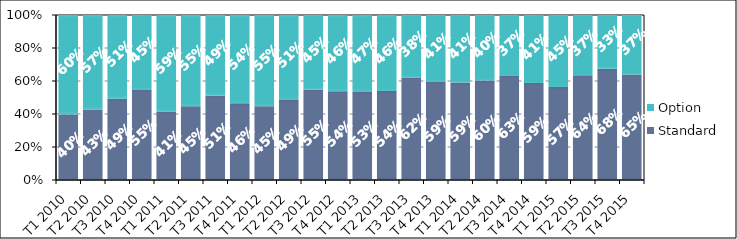
| Category | Standard | Option |
|---|---|---|
| T1 2010 | 0.397 | 0.603 |
| T2 2010 | 0.428 | 0.572 |
| T3 2010 | 0.492 | 0.508 |
| T4 2010 | 0.546 | 0.454 |
| T1 2011 | 0.415 | 0.585 |
| T2 2011 | 0.447 | 0.553 |
| T3 2011 | 0.511 | 0.489 |
| T4 2011 | 0.465 | 0.535 |
| T1 2012 | 0.447 | 0.553 |
| T2 2012 | 0.485 | 0.515 |
| T3 2012 | 0.548 | 0.452 |
| T4 2012 | 0.538 | 0.462 |
| T1 2013 | 0.534 | 0.466 |
| T2 2013 | 0.539 | 0.461 |
| T3 2013 | 0.621 | 0.379 |
| T4 2013 | 0.594 | 0.406 |
| T1 2014 | 0.591 | 0.409 |
| T2 2014 | 0.602 | 0.398 |
| T3 2014 | 0.63 | 0.37 |
| T4 2014 | 0.588 | 0.412 |
| T1 2015 | 0.575 | 0.446 |
| T2 2015 | 0.645 | 0.371 |
| T3 2015 | 0.682 | 0.329 |
| T4 2015 | 0.65 | 0.366 |